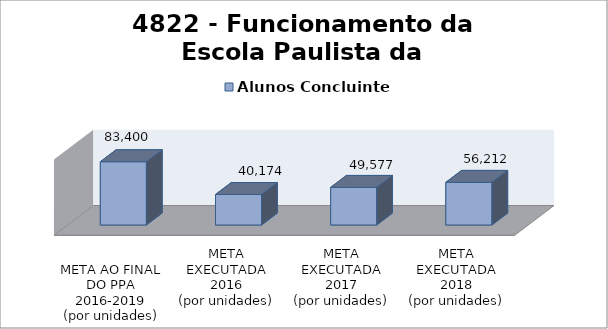
| Category | Alunos Concluintes |
|---|---|
| 
META AO FINAL
DO PPA
2016-2019
(por unidades)
 | 83400 |
| META EXECUTADA
2016
(por unidades) | 40174 |
| META EXECUTADA
2017
(por unidades) | 49577 |
| META EXECUTADA
2018
(por unidades) | 56212 |